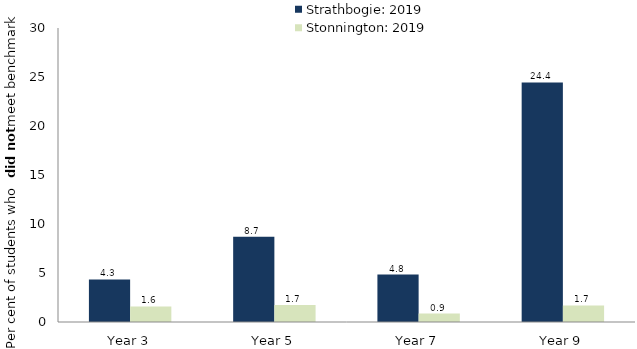
| Category | Strathbogie: 2019 | Stonnington: 2019 |
|---|---|---|
| Year 3 | 4.348 | 1.586 |
| Year 5 | 8.696 | 1.744 |
| Year 7 | 4.839 | 0.858 |
| Year 9 | 24.444 | 1.69 |